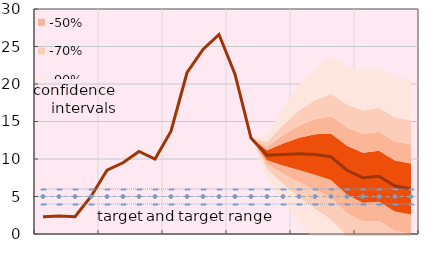
| Category | Series 8 | Series 10 | Series 11 | Series 12 |
|---|---|---|---|---|
|  | 2.3 | 4 | 5 | 6 |
|  | 2.4 | 4 | 5 | 6 |
|  | 2.3 | 4 | 5 | 6 |
| IV.20 | 5 | 4 | 5 | 6 |
|  | 8.5 | 4 | 5 | 6 |
|  | 9.5 | 4 | 5 | 6 |
|  | 11 | 4 | 5 | 6 |
| IV.21 | 10 | 4 | 5 | 6 |
|  | 13.7 | 4 | 5 | 6 |
|  | 21.5 | 4 | 5 | 6 |
|  | 24.6 | 4 | 5 | 6 |
| IV.22 | 26.6 | 4 | 5 | 6 |
|  | 21.3 | 4 | 5 | 6 |
|  | 12.8 | 4 | 5 | 6 |
|  | 10.5 | 4 | 5 | 6 |
| IV.23 | 10.6 | 4 | 5 | 6 |
|  | 10.7 | 4 | 5 | 6 |
|  | 10.6 | 4 | 5 | 6 |
|  | 10.3 | 4 | 5 | 6 |
| IV.24 | 8.5 | 4 | 5 | 6 |
|  | 7.5 | 4 | 5 | 6 |
|  | 7.7 | 4 | 5 | 6 |
|  | 6.4 | 4 | 5 | 6 |
| IV.25 | 6 | 4 | 5 | 6 |